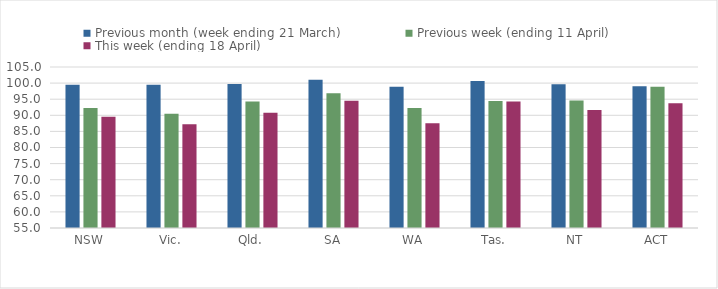
| Category | Previous month (week ending 21 March) | Previous week (ending 11 April) | This week (ending 18 April) |
|---|---|---|---|
| NSW | 99.455 | 92.277 | 89.538 |
| Vic. | 99.473 | 90.47 | 87.244 |
| Qld. | 99.682 | 94.285 | 90.818 |
| SA | 101.024 | 96.869 | 94.509 |
| WA | 98.828 | 92.237 | 87.544 |
| Tas. | 100.646 | 94.435 | 94.258 |
| NT | 99.655 | 94.576 | 91.679 |
| ACT | 99.045 | 98.891 | 93.744 |